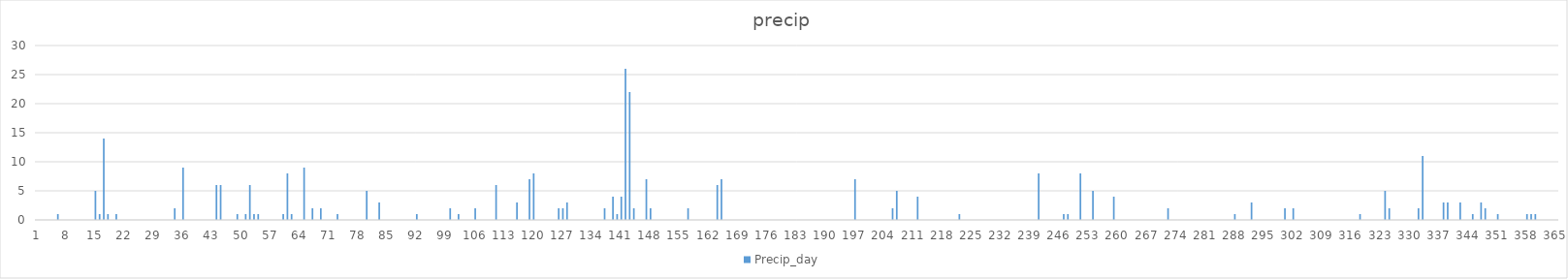
| Category | Precip_day |
|---|---|
| 0 | 0 |
| 1 | 0 |
| 2 | 0 |
| 3 | 0 |
| 4 | 0 |
| 5 | 1 |
| 6 | 0 |
| 7 | 0 |
| 8 | 0 |
| 9 | 0 |
| 10 | 0 |
| 11 | 0 |
| 12 | 0 |
| 13 | 0 |
| 14 | 5 |
| 15 | 1 |
| 16 | 14 |
| 17 | 1 |
| 18 | 0 |
| 19 | 1 |
| 20 | 0 |
| 21 | 0 |
| 22 | 0 |
| 23 | 0 |
| 24 | 0 |
| 25 | 0 |
| 26 | 0 |
| 27 | 0 |
| 28 | 0 |
| 29 | 0 |
| 30 | 0 |
| 31 | 0 |
| 32 | 0 |
| 33 | 2 |
| 34 | 0 |
| 35 | 9 |
| 36 | 0 |
| 37 | 0 |
| 38 | 0 |
| 39 | 0 |
| 40 | 0 |
| 41 | 0 |
| 42 | 0 |
| 43 | 6 |
| 44 | 6 |
| 45 | 0 |
| 46 | 0 |
| 47 | 0 |
| 48 | 1 |
| 49 | 0 |
| 50 | 1 |
| 51 | 6 |
| 52 | 1 |
| 53 | 1 |
| 54 | 0 |
| 55 | 0 |
| 56 | 0 |
| 57 | 0 |
| 58 | 0 |
| 59 | 1 |
| 60 | 8 |
| 61 | 1 |
| 62 | 0 |
| 63 | 0 |
| 64 | 9 |
| 65 | 0 |
| 66 | 2 |
| 67 | 0 |
| 68 | 2 |
| 69 | 0 |
| 70 | 0 |
| 71 | 0 |
| 72 | 1 |
| 73 | 0 |
| 74 | 0 |
| 75 | 0 |
| 76 | 0 |
| 77 | 0 |
| 78 | 0 |
| 79 | 5 |
| 80 | 0 |
| 81 | 0 |
| 82 | 3 |
| 83 | 0 |
| 84 | 0 |
| 85 | 0 |
| 86 | 0 |
| 87 | 0 |
| 88 | 0 |
| 89 | 0 |
| 90 | 0 |
| 91 | 1 |
| 92 | 0 |
| 93 | 0 |
| 94 | 0 |
| 95 | 0 |
| 96 | 0 |
| 97 | 0 |
| 98 | 0 |
| 99 | 2 |
| 100 | 0 |
| 101 | 1 |
| 102 | 0 |
| 103 | 0 |
| 104 | 0 |
| 105 | 2 |
| 106 | 0 |
| 107 | 0 |
| 108 | 0 |
| 109 | 0 |
| 110 | 6 |
| 111 | 0 |
| 112 | 0 |
| 113 | 0 |
| 114 | 0 |
| 115 | 3 |
| 116 | 0 |
| 117 | 0 |
| 118 | 7 |
| 119 | 8 |
| 120 | 0 |
| 121 | 0 |
| 122 | 0 |
| 123 | 0 |
| 124 | 0 |
| 125 | 2 |
| 126 | 2 |
| 127 | 3 |
| 128 | 0 |
| 129 | 0 |
| 130 | 0 |
| 131 | 0 |
| 132 | 0 |
| 133 | 0 |
| 134 | 0 |
| 135 | 0 |
| 136 | 2 |
| 137 | 0 |
| 138 | 4 |
| 139 | 1 |
| 140 | 4 |
| 141 | 26 |
| 142 | 22 |
| 143 | 2 |
| 144 | 0 |
| 145 | 0 |
| 146 | 7 |
| 147 | 2 |
| 148 | 0 |
| 149 | 0 |
| 150 | 0 |
| 151 | 0 |
| 152 | 0 |
| 153 | 0 |
| 154 | 0 |
| 155 | 0 |
| 156 | 2 |
| 157 | 0 |
| 158 | 0 |
| 159 | 0 |
| 160 | 0 |
| 161 | 0 |
| 162 | 0 |
| 163 | 6 |
| 164 | 7 |
| 165 | 0 |
| 166 | 0 |
| 167 | 0 |
| 168 | 0 |
| 169 | 0 |
| 170 | 0 |
| 171 | 0 |
| 172 | 0 |
| 173 | 0 |
| 174 | 0 |
| 175 | 0 |
| 176 | 0 |
| 177 | 0 |
| 178 | 0 |
| 179 | 0 |
| 180 | 0 |
| 181 | 0 |
| 182 | 0 |
| 183 | 0 |
| 184 | 0 |
| 185 | 0 |
| 186 | 0 |
| 187 | 0 |
| 188 | 0 |
| 189 | 0 |
| 190 | 0 |
| 191 | 0 |
| 192 | 0 |
| 193 | 0 |
| 194 | 0 |
| 195 | 0 |
| 196 | 7 |
| 197 | 0 |
| 198 | 0 |
| 199 | 0 |
| 200 | 0 |
| 201 | 0 |
| 202 | 0 |
| 203 | 0 |
| 204 | 0 |
| 205 | 2 |
| 206 | 5 |
| 207 | 0 |
| 208 | 0 |
| 209 | 0 |
| 210 | 0 |
| 211 | 4 |
| 212 | 0 |
| 213 | 0 |
| 214 | 0 |
| 215 | 0 |
| 216 | 0 |
| 217 | 0 |
| 218 | 0 |
| 219 | 0 |
| 220 | 0 |
| 221 | 1 |
| 222 | 0 |
| 223 | 0 |
| 224 | 0 |
| 225 | 0 |
| 226 | 0 |
| 227 | 0 |
| 228 | 0 |
| 229 | 0 |
| 230 | 0 |
| 231 | 0 |
| 232 | 0 |
| 233 | 0 |
| 234 | 0 |
| 235 | 0 |
| 236 | 0 |
| 237 | 0 |
| 238 | 0 |
| 239 | 0 |
| 240 | 8 |
| 241 | 0 |
| 242 | 0 |
| 243 | 0 |
| 244 | 0 |
| 245 | 0 |
| 246 | 1 |
| 247 | 1 |
| 248 | 0 |
| 249 | 0 |
| 250 | 8 |
| 251 | 0 |
| 252 | 0 |
| 253 | 5 |
| 254 | 0 |
| 255 | 0 |
| 256 | 0 |
| 257 | 0 |
| 258 | 4 |
| 259 | 0 |
| 260 | 0 |
| 261 | 0 |
| 262 | 0 |
| 263 | 0 |
| 264 | 0 |
| 265 | 0 |
| 266 | 0 |
| 267 | 0 |
| 268 | 0 |
| 269 | 0 |
| 270 | 0 |
| 271 | 2 |
| 272 | 0 |
| 273 | 0 |
| 274 | 0 |
| 275 | 0 |
| 276 | 0 |
| 277 | 0 |
| 278 | 0 |
| 279 | 0 |
| 280 | 0 |
| 281 | 0 |
| 282 | 0 |
| 283 | 0 |
| 284 | 0 |
| 285 | 0 |
| 286 | 0 |
| 287 | 1 |
| 288 | 0 |
| 289 | 0 |
| 290 | 0 |
| 291 | 3 |
| 292 | 0 |
| 293 | 0 |
| 294 | 0 |
| 295 | 0 |
| 296 | 0 |
| 297 | 0 |
| 298 | 0 |
| 299 | 2 |
| 300 | 0 |
| 301 | 2 |
| 302 | 0 |
| 303 | 0 |
| 304 | 0 |
| 305 | 0 |
| 306 | 0 |
| 307 | 0 |
| 308 | 0 |
| 309 | 0 |
| 310 | 0 |
| 311 | 0 |
| 312 | 0 |
| 313 | 0 |
| 314 | 0 |
| 315 | 0 |
| 316 | 0 |
| 317 | 1 |
| 318 | 0 |
| 319 | 0 |
| 320 | 0 |
| 321 | 0 |
| 322 | 0 |
| 323 | 5 |
| 324 | 2 |
| 325 | 0 |
| 326 | 0 |
| 327 | 0 |
| 328 | 0 |
| 329 | 0 |
| 330 | 0 |
| 331 | 2 |
| 332 | 11 |
| 333 | 0 |
| 334 | 0 |
| 335 | 0 |
| 336 | 0 |
| 337 | 3 |
| 338 | 3 |
| 339 | 0 |
| 340 | 0 |
| 341 | 3 |
| 342 | 0 |
| 343 | 0 |
| 344 | 1 |
| 345 | 0 |
| 346 | 3 |
| 347 | 2 |
| 348 | 0 |
| 349 | 0 |
| 350 | 1 |
| 351 | 0 |
| 352 | 0 |
| 353 | 0 |
| 354 | 0 |
| 355 | 0 |
| 356 | 0 |
| 357 | 1 |
| 358 | 1 |
| 359 | 1 |
| 360 | 0 |
| 361 | 0 |
| 362 | 0 |
| 363 | 0 |
| 364 | 0 |